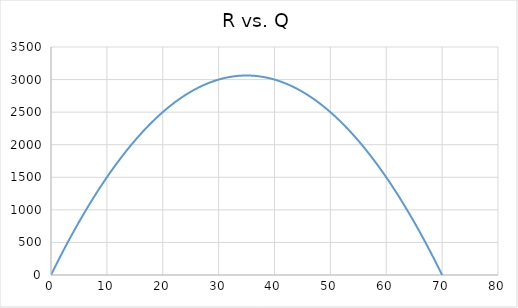
| Category | Series 0 |
|---|---|
| 0.0 | 0 |
| 1.0 | 172.5 |
| 2.0 | 340 |
| 3.0 | 502.5 |
| 4.0 | 660 |
| 5.0 | 812.5 |
| 6.0 | 960 |
| 7.0 | 1102.5 |
| 8.0 | 1240 |
| 9.0 | 1372.5 |
| 10.0 | 1500 |
| 11.0 | 1622.5 |
| 12.0 | 1740 |
| 13.0 | 1852.5 |
| 14.0 | 1960 |
| 15.0 | 2062.5 |
| 16.0 | 2160 |
| 17.0 | 2252.5 |
| 18.0 | 2340 |
| 19.0 | 2422.5 |
| 20.0 | 2500 |
| 21.0 | 2572.5 |
| 22.0 | 2640 |
| 23.0 | 2702.5 |
| 24.0 | 2760 |
| 25.0 | 2812.5 |
| 26.0 | 2860 |
| 27.0 | 2902.5 |
| 28.0 | 2940 |
| 29.0 | 2972.5 |
| 30.0 | 3000 |
| 31.0 | 3022.5 |
| 32.0 | 3040 |
| 33.0 | 3052.5 |
| 34.0 | 3060 |
| 35.0 | 3062.5 |
| 36.0 | 3060 |
| 37.0 | 3052.5 |
| 38.0 | 3040 |
| 39.0 | 3022.5 |
| 40.0 | 3000 |
| 41.0 | 2972.5 |
| 42.0 | 2940 |
| 43.0 | 2902.5 |
| 44.0 | 2860 |
| 45.0 | 2812.5 |
| 46.0 | 2760 |
| 47.0 | 2702.5 |
| 48.0 | 2640 |
| 49.0 | 2572.5 |
| 50.0 | 2500 |
| 51.0 | 2422.5 |
| 52.0 | 2340 |
| 53.0 | 2252.5 |
| 54.0 | 2160 |
| 55.0 | 2062.5 |
| 56.0 | 1960 |
| 57.0 | 1852.5 |
| 58.0 | 1740 |
| 59.0 | 1622.5 |
| 60.0 | 1500 |
| 61.0 | 1372.5 |
| 62.0 | 1240 |
| 63.0 | 1102.5 |
| 64.0 | 960 |
| 65.0 | 812.5 |
| 66.0 | 660 |
| 67.0 | 502.5 |
| 68.0 | 340 |
| 69.0 | 172.5 |
| 70.0 | 0 |